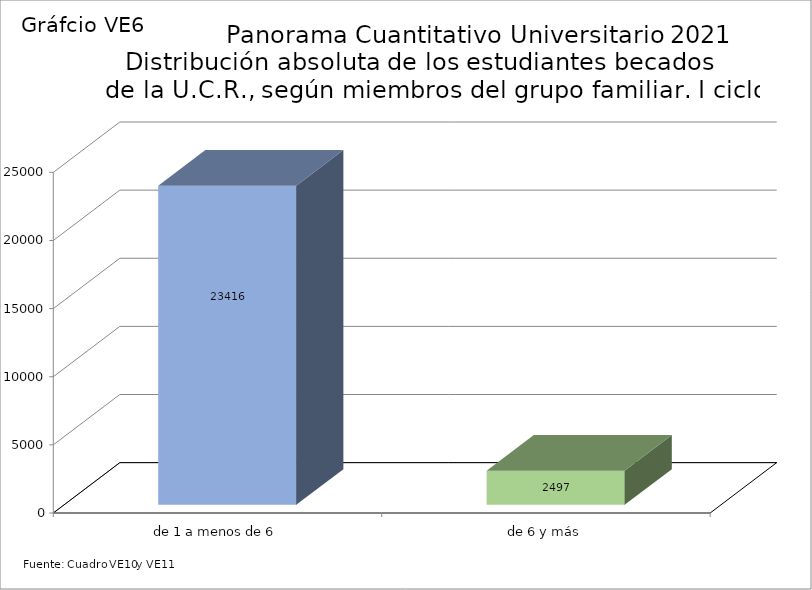
| Category | Series 0 |
|---|---|
| de 1 a menos de 6 | 23416 |
| de 6 y más | 2497 |